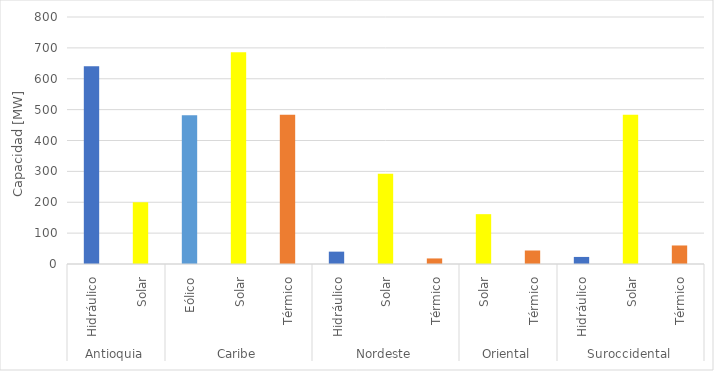
| Category | Total |
|---|---|
| 0 | 640.585 |
| 1 | 200 |
| 2 | 481.8 |
| 3 | 686.07 |
| 4 | 483 |
| 5 | 40 |
| 6 | 292.3 |
| 7 | 18 |
| 8 | 161.4 |
| 9 | 43.74 |
| 10 | 22.9 |
| 11 | 483.1 |
| 12 | 60 |